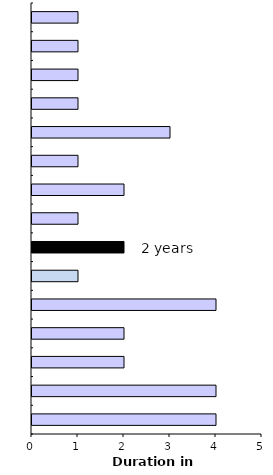
| Category | Series 0 |
|---|---|
| 0 | 4 |
| 1 | 4 |
| 2 | 2 |
| 3 | 2 |
| 4 | 4 |
| 5 | 1 |
| 6 | 2 |
| 7 | 1 |
| 8 | 2 |
| 9 | 1 |
| 10 | 3 |
| 11 | 1 |
| 12 | 1 |
| 13 | 1 |
| 14 | 1 |